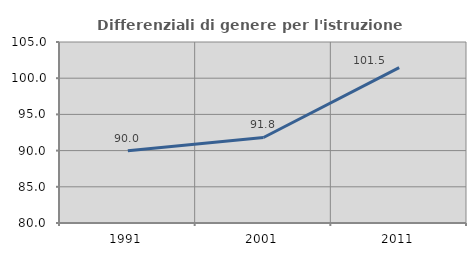
| Category | Differenziali di genere per l'istruzione superiore |
|---|---|
| 1991.0 | 89.969 |
| 2001.0 | 91.812 |
| 2011.0 | 101.452 |